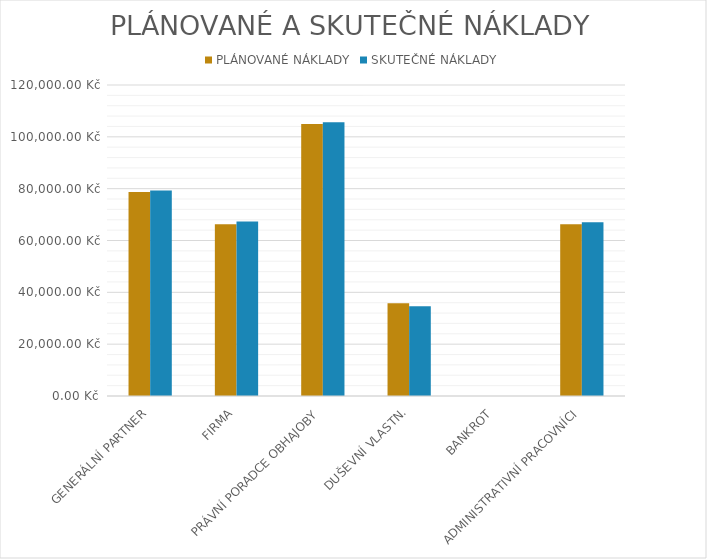
| Category | PLÁNOVANÉ NÁKLADY | SKUTEČNÉ NÁKLADY |
|---|---|---|
| GENERÁLNÍ PARTNER | 78750 | 79275 |
| FIRMA | 66250 | 67375 |
| PRÁVNÍ PORADCE OBHAJOBY | 105000 | 105600 |
| DUŠEVNÍ VLASTN. | 35750 | 34650 |
| BANKROT | 0 | 0 |
| ADMINISTRATIVNÍ PRACOVNÍCI | 66250 | 67000 |